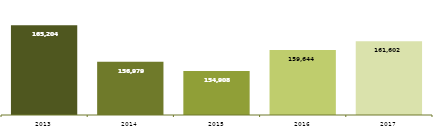
| Category | INTERNAÇÕES |
|---|---|
| 2013.0 | 165204 |
| 2014.0 | 156979 |
| 2015.0 | 154908 |
| 2016.0 | 159644 |
| 2017.0 | 161602 |